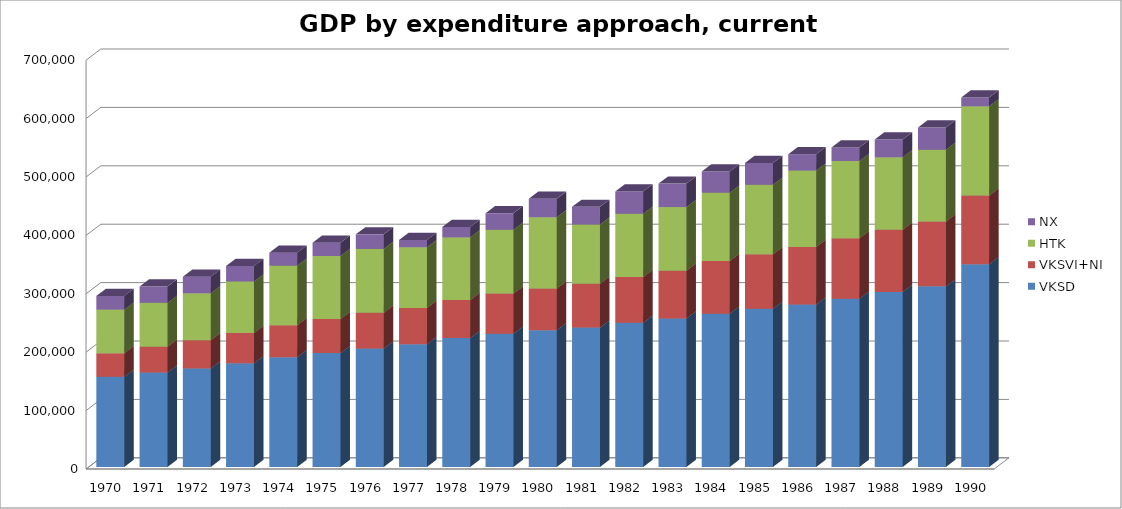
| Category | VKSD | VKSVI+NI | HTK | NX |
|---|---|---|---|---|
| 1970.0 | 154547 | 40158 | 74858 | 23391 |
| 1971.0 | 161751 | 44391 | 75045 | 27772 |
| 1972.0 | 168839 | 48421 | 80251 | 28432 |
| 1973.0 | 177590 | 51918 | 88191 | 26693 |
| 1974.0 | 188151 | 54651 | 102026 | 22248 |
| 1975.0 | 195049 | 58222 | 108058 | 22730 |
| 1976.0 | 203069 | 61260 | 109155 | 24899 |
| 1977.0 | 210094 | 62280 | 104011 | 12506 |
| 1978.0 | 220971 | 64894 | 107390 | 17703 |
| 1979.0 | 228332 | 68572 | 109385 | 28138 |
| 1980.0 | 234301 | 71369 | 122114 | 31463 |
| 1981.0 | 238691 | 75296 | 101344 | 30121 |
| 1982.0 | 246997 | 78543 | 108129 | 38098 |
| 1983.0 | 254391 | 81780 | 108911 | 40211 |
| 1984.0 | 262367 | 90576 | 116868 | 36192 |
| 1985.0 | 271180 | 93249 | 118906 | 37293 |
| 1986.0 | 278483 | 98226 | 130987 | 27941 |
| 1987.0 | 288109 | 103556 | 132317 | 23174 |
| 1988.0 | 299783 | 106653 | 123925 | 30361 |
| 1989.0 | 309518 | 110805 | 122888 | 38035 |
| 1990.0 | 347312 | 117592 | 152823 | 14964 |